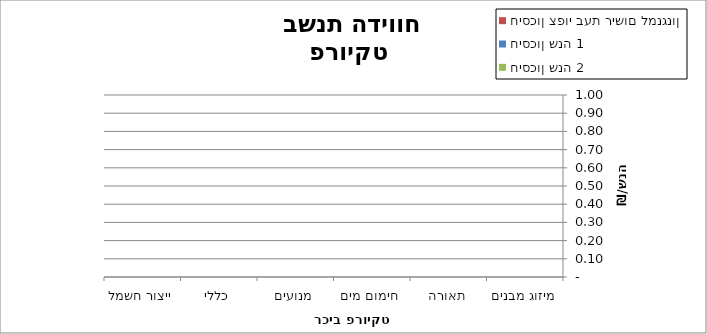
| Category | חיסכון צפוי בעת רישום למנגנון | חיסכון שנה 1 | חיסכון שנה 2 |
|---|---|---|---|
| מיזוג מבנים | 0 | 0 | 0 |
| תאורה | 0 | 0 | 0 |
| חימום מים | 0 | 0 | 0 |
| מנועים | 0 | 0 | 0 |
| כללי | 0 | 0 | 0 |
| ייצור חשמל | 0 | 0 | 0 |